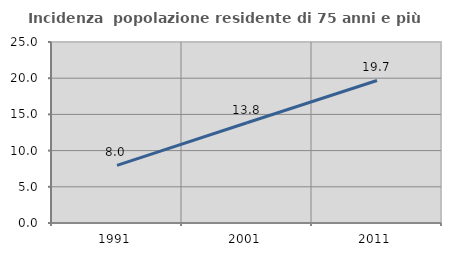
| Category | Incidenza  popolazione residente di 75 anni e più |
|---|---|
| 1991.0 | 7.966 |
| 2001.0 | 13.841 |
| 2011.0 | 19.685 |